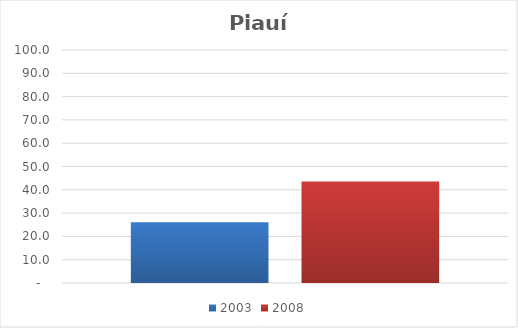
| Category | 2003 | 2008 |
|---|---|---|
| Total | 26.1 | 43.6 |